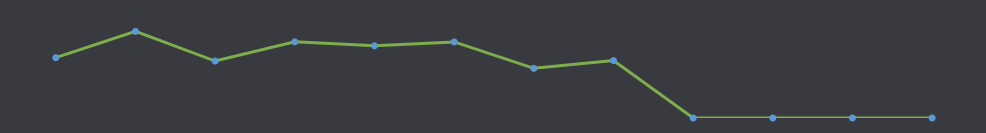
| Category | Налични парични средства |
|---|---|
| ЯНУ | 820 |
| ФЕВ | 1177 |
| МАР | 774 |
| АПР | 1035 |
| МАЙ | 981 |
| ЮНИ | 1034 |
| ЮЛИ | 675 |
| АВГ | 781 |
| СЕП | 0 |
| ОКТ | 0 |
| НОЕ | 0 |
| ДЕК | 0 |